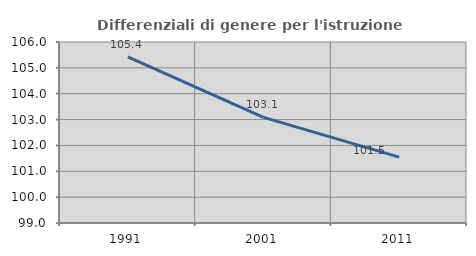
| Category | Differenziali di genere per l'istruzione superiore |
|---|---|
| 1991.0 | 105.42 |
| 2001.0 | 103.087 |
| 2011.0 | 101.549 |